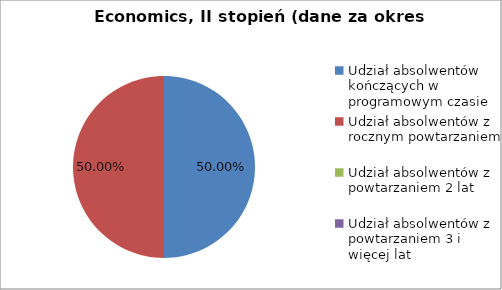
| Category | Series 0 |
|---|---|
| Udział absolwentów kończących w programowym czasie | 50 |
| Udział absolwentów z rocznym powtarzaniem | 50 |
| Udział absolwentów z powtarzaniem 2 lat | 0 |
| Udział absolwentów z powtarzaniem 3 i więcej lat | 0 |